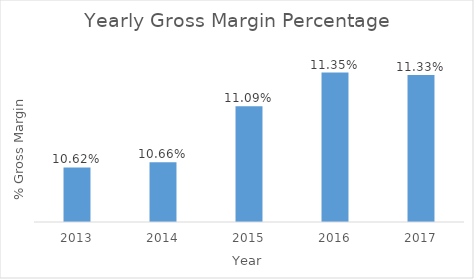
| Category | Series 0 |
|---|---|
| 2013.0 | 0.106 |
| 2014.0 | 0.107 |
| 2015.0 | 0.111 |
| 2016.0 | 0.114 |
| 2017.0 | 0.113 |